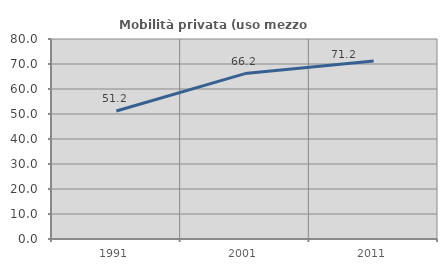
| Category | Mobilità privata (uso mezzo privato) |
|---|---|
| 1991.0 | 51.217 |
| 2001.0 | 66.165 |
| 2011.0 | 71.19 |